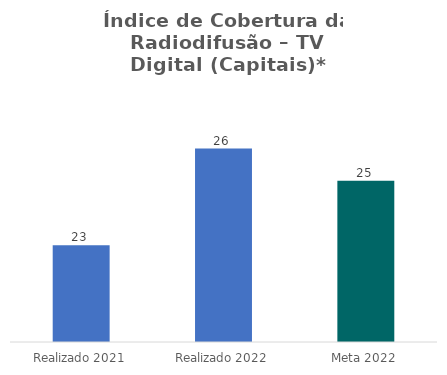
| Category | Series 0 |
|---|---|
| Realizado 2021 | 23 |
| Realizado 2022 | 26 |
| Meta 2022 | 25 |